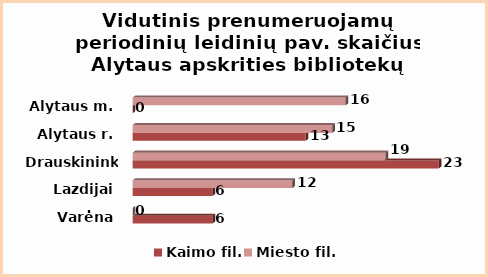
| Category | Kaimo fil. | Miesto fil. |
|---|---|---|
| Varėna | 6 | 0 |
| Lazdijai | 6 | 12 |
| Drauskininkai | 23 | 19 |
| Alytaus r. | 13 | 15 |
| Alytaus m. | 0 | 16 |